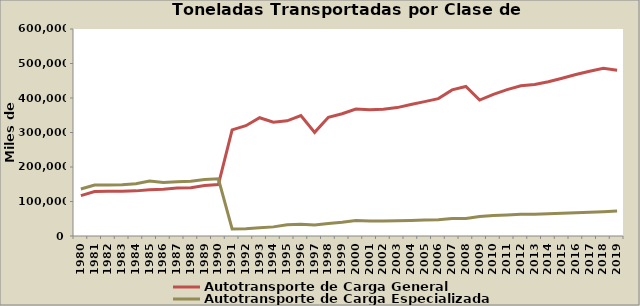
| Category | Autotransporte de Carga General | Autotransporte de Carga Especializada |
|---|---|---|
| 1980.0 | 117023 | 136146 |
| 1981.0 | 128754 | 147538 |
| 1982.0 | 129354 | 147999 |
| 1983.0 | 129714 | 148368 |
| 1984.0 | 130806 | 151377 |
| 1985.0 | 134112 | 159297 |
| 1986.0 | 135595 | 154964 |
| 1987.0 | 138810 | 157278 |
| 1988.0 | 140134 | 158736 |
| 1989.0 | 146292 | 163511 |
| 1990.0 | 149009 | 165666 |
| 1991.0 | 307444 | 20329 |
| 1992.0 | 319742 | 21318 |
| 1993.0 | 342871 | 23757 |
| 1994.0 | 330053 | 26434 |
| 1995.0 | 333800 | 32873 |
| 1996.0 | 349142 | 34125 |
| 1997.0 | 300444 | 32022 |
| 1998.0 | 344282 | 36519 |
| 1999.0 | 354241 | 40191 |
| 2000.0 | 368066 | 45127 |
| 2001.0 | 365912 | 43298 |
| 2002.0 | 367600 | 43500 |
| 2003.0 | 372150 | 44050 |
| 2004.0 | 381000 | 45100 |
| 2005.0 | 389400 | 46100 |
| 2006.0 | 398158 | 47291 |
| 2007.0 | 423458.767 | 50401.095 |
| 2008.0 | 433400 | 50900 |
| 2009.0 | 394079 | 56821 |
| 2010.0 | 410772 | 59228 |
| 2011.0 | 424321 | 61181 |
| 2012.0 | 435373 | 62774 |
| 2013.0 | 438871 | 63279 |
| 2014.0 | 446903 | 64437 |
| 2015.0 | 457085 | 65905 |
| 2016.0 | 468060 | 67488 |
| 2017.0 | 477709 | 68879 |
| 2018.0 | 486296 | 70115 |
| 2019.0 | 480211 | 72107 |